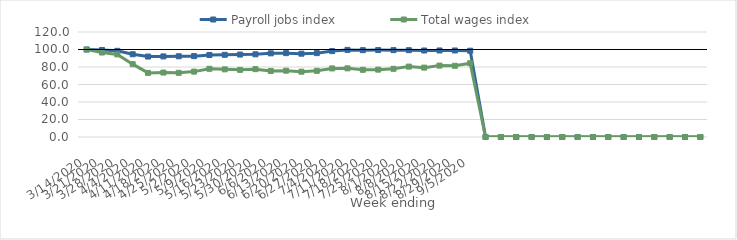
| Category | Payroll jobs index | Total wages index |
|---|---|---|
| 14/03/2020 | 100 | 100 |
| 21/03/2020 | 99.466 | 96.55 |
| 28/03/2020 | 98.468 | 94.402 |
| 04/04/2020 | 94.578 | 83.227 |
| 11/04/2020 | 91.929 | 73.252 |
| 18/04/2020 | 92.095 | 73.649 |
| 25/04/2020 | 92.251 | 73.35 |
| 02/05/2020 | 92.428 | 74.723 |
| 09/05/2020 | 93.761 | 77.942 |
| 16/05/2020 | 93.926 | 77.32 |
| 23/05/2020 | 94.216 | 76.732 |
| 30/05/2020 | 94.511 | 77.541 |
| 06/06/2020 | 95.606 | 75.524 |
| 13/06/2020 | 95.833 | 75.8 |
| 20/06/2020 | 95.196 | 74.653 |
| 27/06/2020 | 95.842 | 75.629 |
| 04/07/2020 | 98.173 | 78.37 |
| 11/07/2020 | 99.561 | 78.432 |
| 18/07/2020 | 99.235 | 76.817 |
| 25/07/2020 | 99.389 | 76.989 |
| 01/08/2020 | 99.253 | 77.944 |
| 08/08/2020 | 99.215 | 80.463 |
| 15/08/2020 | 98.853 | 79.288 |
| 22/08/2020 | 98.894 | 81.611 |
| 29/08/2020 | 98.88 | 81.357 |
| 05/09/2020 | 98.592 | 84.322 |